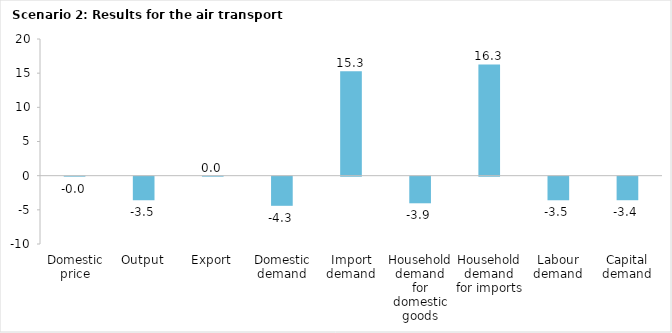
| Category | Series 0 |
|---|---|
| Domestic price | -0.003 |
| Output | -3.451 |
| Export | 0.003 |
| Domestic demand | -4.265 |
| Import demand | 15.279 |
| Household demand for domestic goods | -3.895 |
| Household demand for imports | 16.281 |
| Labour demand | -3.453 |
| Capital demand | -3.448 |